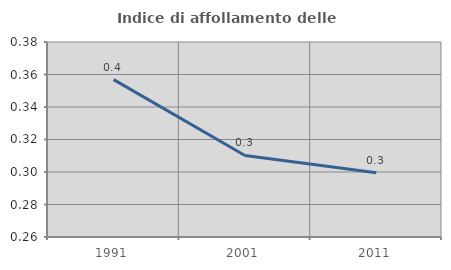
| Category | Indice di affollamento delle abitazioni  |
|---|---|
| 1991.0 | 0.357 |
| 2001.0 | 0.31 |
| 2011.0 | 0.3 |